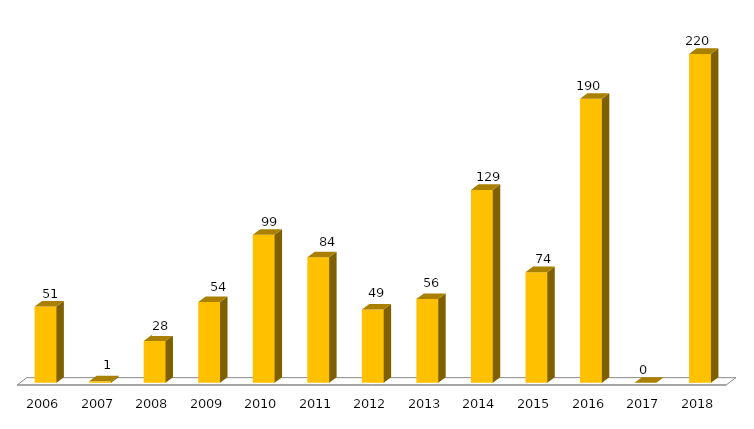
| Category | Especialização |
|---|---|
| 2006.0 | 51 |
| 2007.0 | 1 |
| 2008.0 | 28 |
| 2009.0 | 54 |
| 2010.0 | 99 |
| 2011.0 | 84 |
| 2012.0 | 49 |
| 2013.0 | 56 |
| 2014.0 | 129 |
| 2015.0 | 74 |
| 2016.0 | 190 |
| 2017.0 | 0 |
| 2018.0 | 220 |